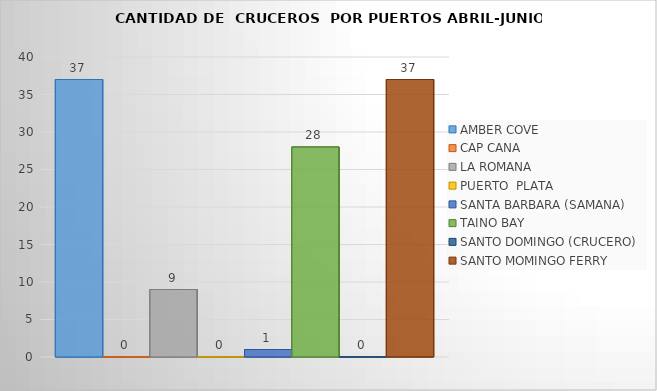
| Category | AMBER COVE | CAP CANA | LA ROMANA | PUERTO  PLATA | SANTA BARBARA (SAMANA) | TAINO BAY | SANTO DOMINGO (CRUCERO) | SANTO MOMINGO FERRY |
|---|---|---|---|---|---|---|---|---|
| 0 | 37 | 0 | 9 | 0 | 1 | 28 | 0 | 37 |